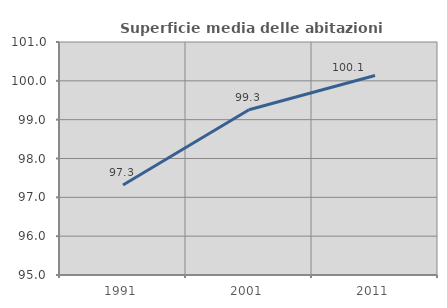
| Category | Superficie media delle abitazioni occupate |
|---|---|
| 1991.0 | 97.32 |
| 2001.0 | 99.254 |
| 2011.0 | 100.137 |